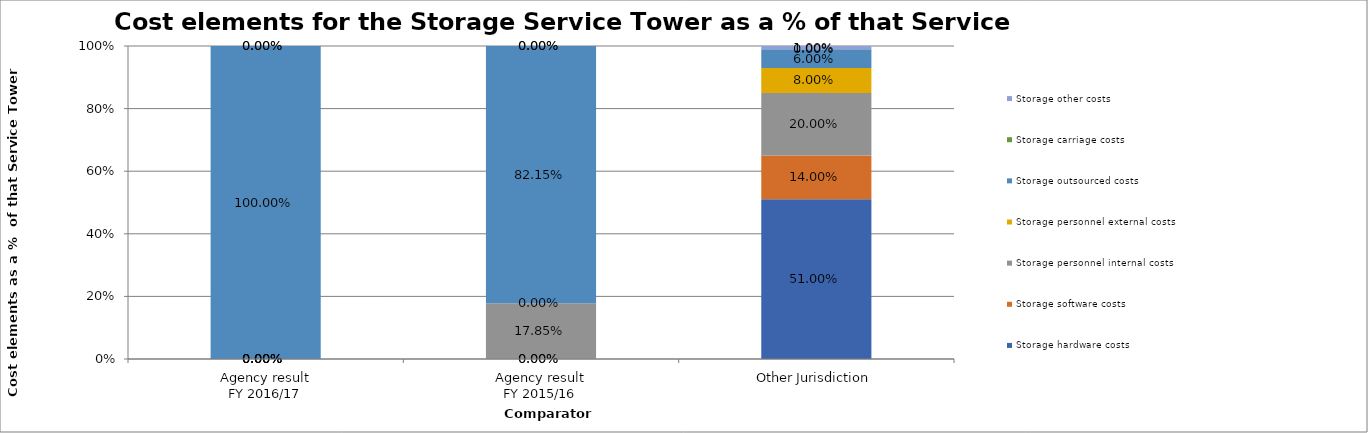
| Category | Storage hardware costs | Storage software costs | Storage personnel internal costs | Storage personnel external costs | Storage outsourced costs | Storage carriage costs | Storage other costs |
|---|---|---|---|---|---|---|---|
| Agency result
FY 2016/17 | 0 | 0 | 0 | 0 | 1 | 0 | 0 |
| Agency result
FY 2015/16 | 0 | 0 | 0.178 | 0 | 0.822 | 0 | 0 |
| Other Jurisdiction | 0.51 | 0.14 | 0.2 | 0.08 | 0.06 | 0 | 0.01 |